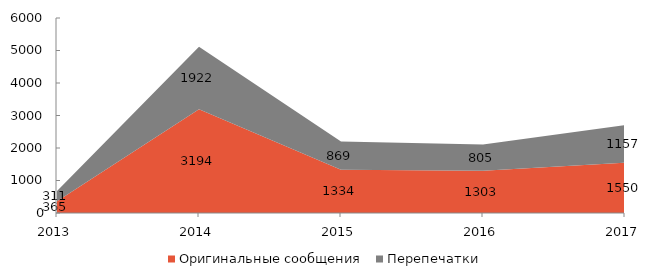
| Category | Оригинальные сообщения | Перепечатки |
|---|---|---|
| 2013 | 365 | 311 |
| 2014 | 3194 | 1922 |
| 2015 | 1334 | 869 |
| 2016 | 1303 | 805 |
| 2017 | 1550 | 1157 |